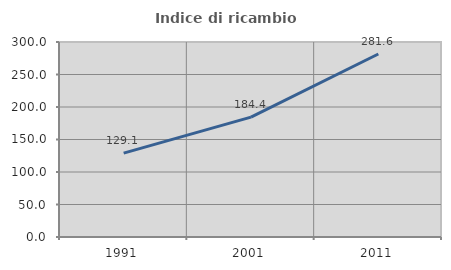
| Category | Indice di ricambio occupazionale  |
|---|---|
| 1991.0 | 129.091 |
| 2001.0 | 184.416 |
| 2011.0 | 281.579 |